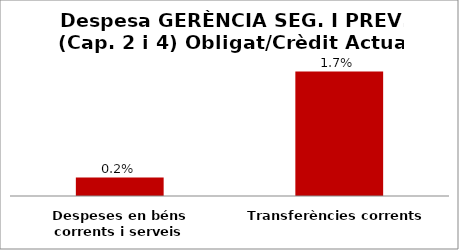
| Category | Series 0 |
|---|---|
| Despeses en béns corrents i serveis | 0.002 |
| Transferències corrents | 0.017 |